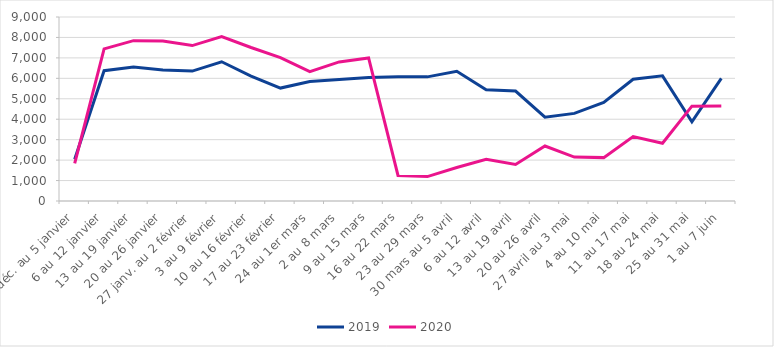
| Category | 2019 | 2020 |
|---|---|---|
| 30 déc. au 5 janvier | 2040 | 1846 |
| 6 au 12 janvier | 6373 | 7441 |
| 13 au 19 janvier | 6555 | 7842 |
| 20 au 26 janvier | 6409 | 7831 |
| 27 janv. au 2 février | 6354 | 7602 |
| 3 au 9 février | 6810 | 8043 |
| 10 au 16 février | 6110 | 7509 |
| 17 au 23 février | 5524 | 7014 |
| 24 au 1er mars | 5849 | 6329 |
| 2 au 8 mars | 5946 | 6803 |
| 9 au 15 mars | 6046 | 6998 |
| 16 au 22 mars | 6072 | 1249 |
| 23 au 29 mars | 6072 | 1194 |
| 30 mars au 5 avril | 6344 | 1641 |
| 6 au 12 avril | 5441 | 2041 |
| 13 au 19 avril | 5376 | 1788 |
| 20 au 26 avril | 4101 | 2691 |
| 27 avril au 3 mai | 4285 | 2149 |
| 4 au 10 mai | 4818 | 2122 |
| 11 au 17 mai | 5955 | 3148 |
| 18 au 24 mai | 6121 | 2823 |
| 25 au 31 mai | 3878 | 4639 |
| 1 au 7 juin | 6002 | 4643 |